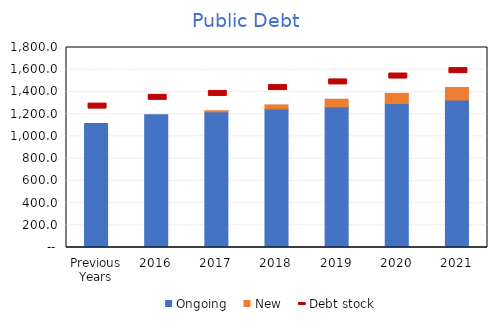
| Category | Ongoing | New |
|---|---|---|
| Previous Years | 1116.718 | 0 |
| 2016 | 1195.728 | 0 |
| 2017 | 1221.012 | 9.939 |
| 2018 | 1247.516 | 35.885 |
| 2019 | 1265.975 | 68.489 |
| 2020 | 1295.2 | 92.228 |
| 2021 | 1327.008 | 113.384 |